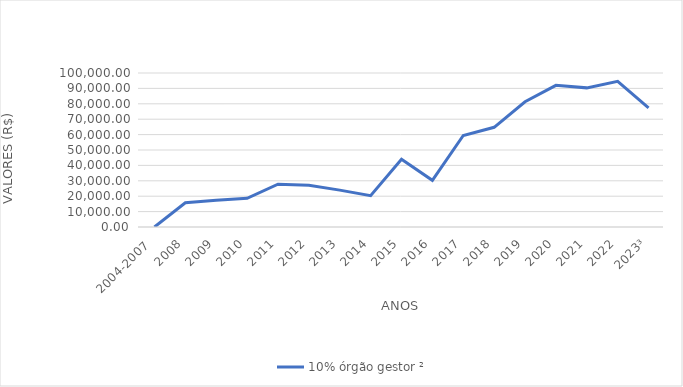
| Category | 10% órgão gestor ² |
|---|---|
| 2004-2007  | 0 |
| 2008 | 15760.55 |
| 2009 | 17405.72 |
| 2010 | 18622.18 |
| 2011 | 27792.63 |
| 2012 | 27040.19 |
| 2013 | 23942.83 |
| 2014 | 20368.5 |
| 2015 | 44051.88 |
| 2016 | 30309.12 |
| 2017 | 59416.73 |
| 2018 | 64727.56 |
| 2019 | 81324.4 |
| 2020 | 91990.98 |
| 2021 | 90347.95 |
| 2022 | 94584.26 |
| 2023³ | 77425.47 |